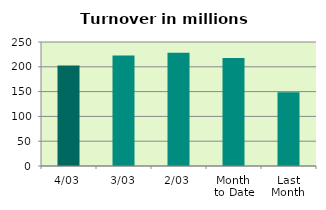
| Category | Series 0 |
|---|---|
| 4/03 | 202.686 |
| 3/03 | 222.584 |
| 2/03 | 228.318 |
| Month 
to Date | 217.863 |
| Last
Month | 148.578 |